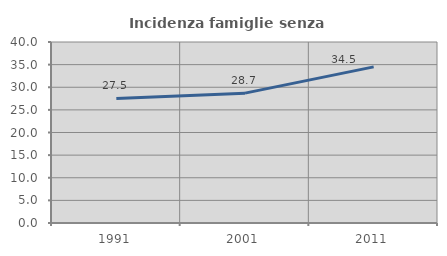
| Category | Incidenza famiglie senza nuclei |
|---|---|
| 1991.0 | 27.529 |
| 2001.0 | 28.7 |
| 2011.0 | 34.506 |